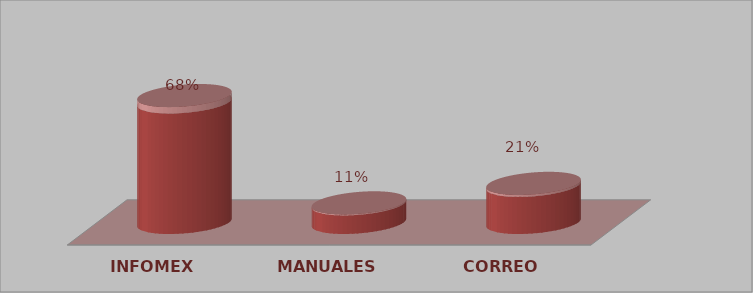
| Category | Series 0 | Series 1 |
|---|---|---|
| INFOMEX | 13 | 0.68 |
| MANUALES | 2 | 0.11 |
| CORREO | 4 | 0.21 |